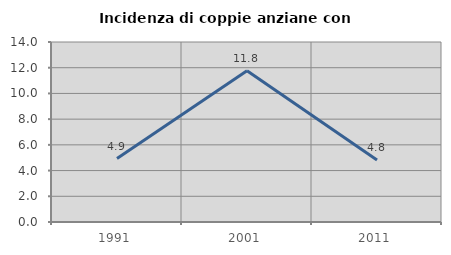
| Category | Incidenza di coppie anziane con figli |
|---|---|
| 1991.0 | 4.938 |
| 2001.0 | 11.765 |
| 2011.0 | 4.819 |